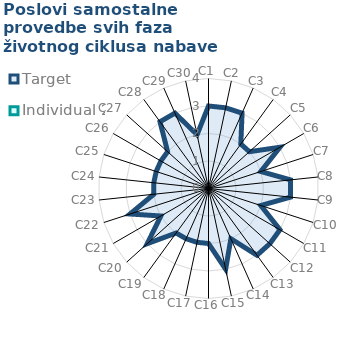
| Category | Target | Individual 2 |
|---|---|---|
| C1 | 3 | 0 |
| C2 | 3 | 0 |
| C3 | 3 | 0 |
| C4 | 2 | 0 |
| C5 | 2 | 0 |
| C6 | 3 | 0 |
| C7 | 2 | 0 |
| C8 | 3 | 0 |
| C9 | 3 | 0 |
| C10 | 2 | 0 |
| C11 | 3 | 0 |
| C12 | 3 | 0 |
| C13 | 3 | 0 |
| C14 | 2 | 0 |
| C15 | 3 | 0 |
| C16 | 2 | 0 |
| C17 | 2 | 0 |
| C18 | 2 | 0 |
| C19 | 2 | 0 |
| C20 | 3 | 0 |
| C21 | 2 | 0 |
| C22 | 3 | 0 |
| C23 | 2 | 0 |
| C24 | 2 | 0 |
| C25 | 2 | 0 |
| C26 | 2 | 0 |
| C27 | 2 | 0 |
| C28 | 3 | 0 |
| C29 | 3 | 0 |
| C30 | 2 | 0 |